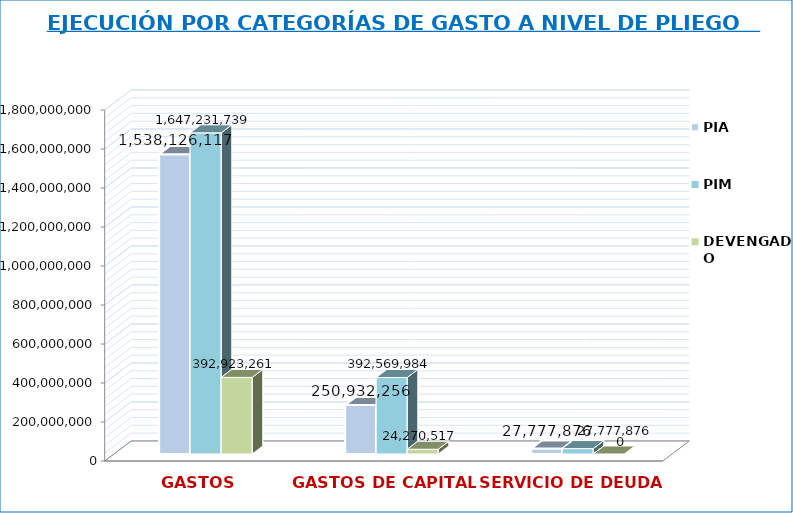
| Category | PIA | PIM | DEVENGADO |
|---|---|---|---|
| GASTOS CORRIENTES | 1538126117 | 1647231739 | 392923261 |
| GASTOS DE CAPITAL | 250932256 | 392569984 | 24270517 |
| SERVICIO DE DEUDA | 27777876 | 27777876 | 0 |